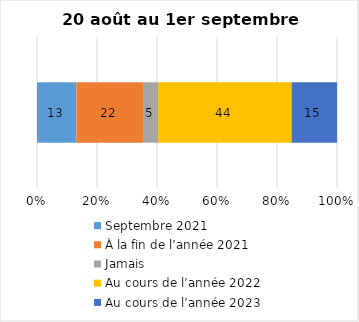
| Category | Septembre 2021 | À la fin de l’année 2021 | Jamais | Au cours de l’année 2022 | Au cours de l’année 2023 |
|---|---|---|---|---|---|
| 0 | 13 | 22 | 5 | 44 | 15 |